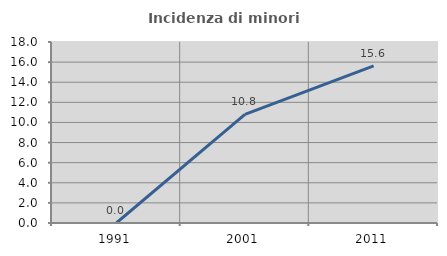
| Category | Incidenza di minori stranieri |
|---|---|
| 1991.0 | 0 |
| 2001.0 | 10.811 |
| 2011.0 | 15.625 |